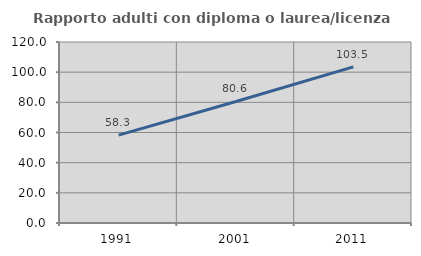
| Category | Rapporto adulti con diploma o laurea/licenza media  |
|---|---|
| 1991.0 | 58.292 |
| 2001.0 | 80.559 |
| 2011.0 | 103.482 |